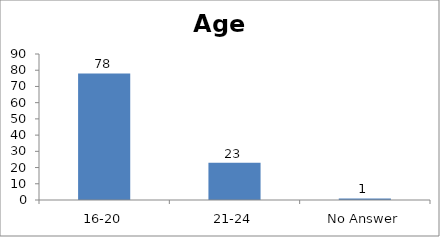
| Category | Age |
|---|---|
| 16-20 | 78 |
| 21-24 | 23 |
| No Answer | 1 |